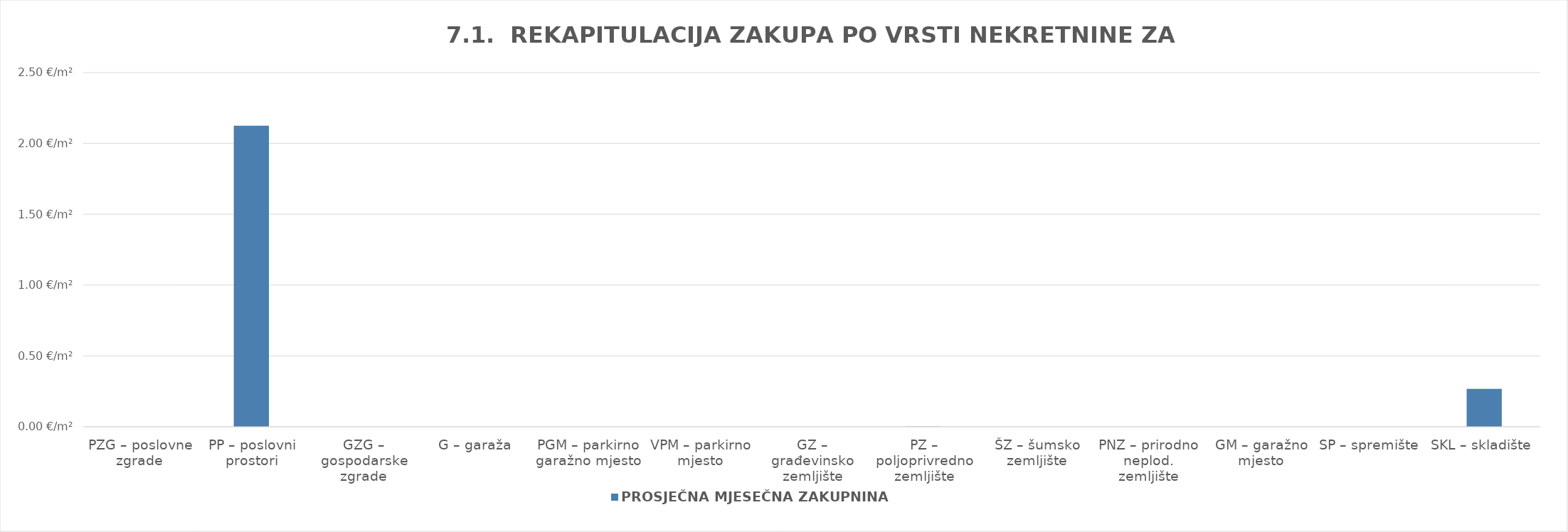
| Category | PROSJEČNA MJESEČNA ZAKUPNINA EUR/m2 |
|---|---|
| PZG – poslovne zgrade | 0 |
| PP – poslovni prostori | 1900-01-02 03:00:27 |
| GZG – gospodarske zgrade | 0 |
| G – garaža | 0 |
| PGM – parkirno garažno mjesto | 0 |
| VPM – parkirno mjesto | 0 |
| GZ – građevinsko zemljište | 0 |
| PZ – poljoprivredno zemljište | 0.001 |
| ŠZ – šumsko zemljište | 0 |
| PNZ – prirodno neplod. zemljište | 0 |
| GM – garažno mjesto | 0 |
| SP – spremište  | 0 |
| SKL – skladište  | 0.268 |